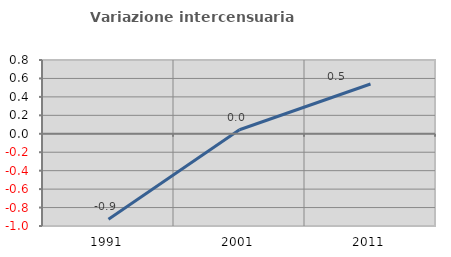
| Category | Variazione intercensuaria annua |
|---|---|
| 1991.0 | -0.927 |
| 2001.0 | 0.044 |
| 2011.0 | 0.54 |